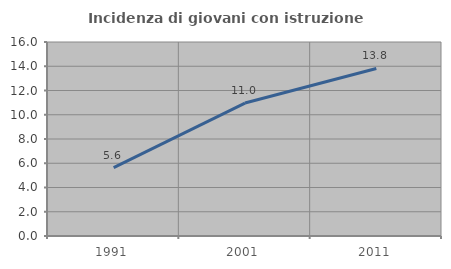
| Category | Incidenza di giovani con istruzione universitaria |
|---|---|
| 1991.0 | 5.634 |
| 2001.0 | 10.965 |
| 2011.0 | 13.816 |